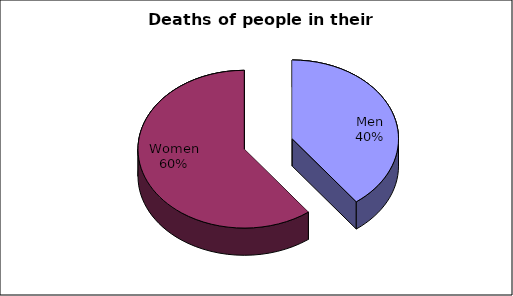
| Category | Series 0 |
|---|---|
| Men | 27 |
| Women | 41 |